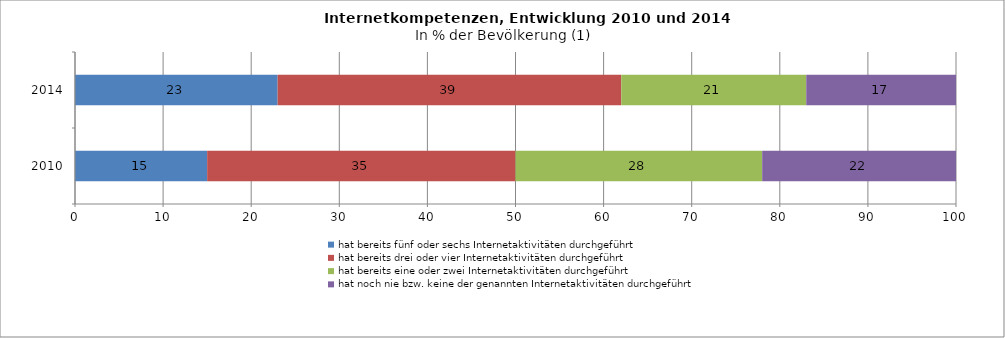
| Category | hat bereits fünf oder sechs Internetaktivitäten durchgeführt | hat bereits drei oder vier Internetaktivitäten durchgeführt | hat bereits eine oder zwei Internetaktivitäten durchgeführt | hat noch nie bzw. keine der genannten Internetaktivitäten durchgeführt |
|---|---|---|---|---|
| 2010.0 | 15 | 35 | 28 | 22 |
| 2014.0 | 23 | 39 | 21 | 17 |